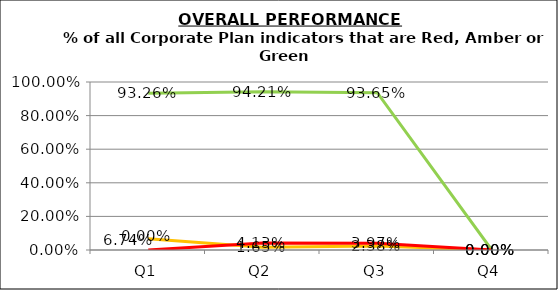
| Category | Green | Amber | Red |
|---|---|---|---|
| Q1 | 0.933 | 0.067 | 0 |
| Q2 | 0.942 | 0.017 | 0.041 |
| Q3 | 0.937 | 0.024 | 0.04 |
| Q4 | 0 | 0 | 0 |